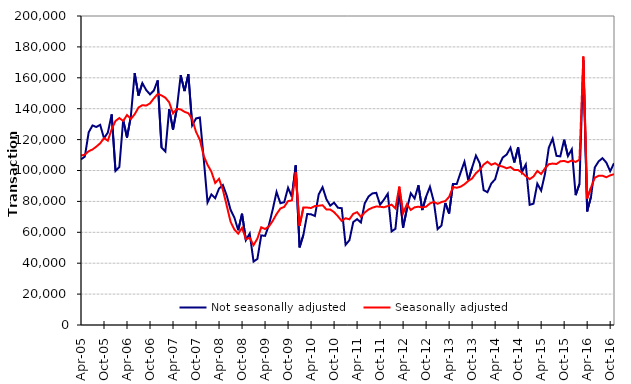
| Category | Not seasonally adjusted | Seasonally adjusted |
|---|---|---|
| 2005-04-01 | 107190 | 109680 |
| 2005-05-01 | 109010 | 110270 |
| 2005-06-01 | 124660 | 112460 |
| 2005-07-01 | 129170 | 113610 |
| 2005-08-01 | 128150 | 115470 |
| 2005-09-01 | 129560 | 117590 |
| 2005-10-01 | 120860 | 120990 |
| 2005-11-01 | 124540 | 119270 |
| 2005-12-01 | 136300 | 126640 |
| 2006-01-01 | 99740 | 132100 |
| 2006-02-01 | 102230 | 133940 |
| 2006-03-01 | 132710 | 132080 |
| 2006-04-01 | 121270 | 135880 |
| 2006-05-01 | 135030 | 133370 |
| 2006-06-01 | 162970 | 136400 |
| 2006-07-01 | 148490 | 140770 |
| 2006-08-01 | 156560 | 142280 |
| 2006-09-01 | 152100 | 142030 |
| 2006-10-01 | 149270 | 143440 |
| 2006-11-01 | 151770 | 146670 |
| 2006-12-01 | 158310 | 149510 |
| 2007-01-01 | 114880 | 148580 |
| 2007-02-01 | 112280 | 147120 |
| 2007-03-01 | 139780 | 144110 |
| 2007-04-01 | 126450 | 136980 |
| 2007-05-01 | 140110 | 139920 |
| 2007-06-01 | 161680 | 139530 |
| 2007-07-01 | 151390 | 137980 |
| 2007-08-01 | 162330 | 137040 |
| 2007-09-01 | 129210 | 133260 |
| 2007-10-01 | 133700 | 124980 |
| 2007-11-01 | 134320 | 119940 |
| 2007-12-01 | 107680 | 109440 |
| 2008-01-01 | 79350 | 103660 |
| 2008-02-01 | 84540 | 99300 |
| 2008-03-01 | 82050 | 91920 |
| 2008-04-01 | 88350 | 94610 |
| 2008-05-01 | 90570 | 87440 |
| 2008-06-01 | 83780 | 77280 |
| 2008-07-01 | 74560 | 66860 |
| 2008-08-01 | 69560 | 61820 |
| 2008-09-01 | 61330 | 59130 |
| 2008-10-01 | 72020 | 62890 |
| 2008-11-01 | 54910 | 55610 |
| 2008-12-01 | 59180 | 56400 |
| 2009-01-01 | 41060 | 51660 |
| 2009-02-01 | 42750 | 55930 |
| 2009-03-01 | 57990 | 63250 |
| 2009-04-01 | 57690 | 62120 |
| 2009-05-01 | 64640 | 63760 |
| 2009-06-01 | 74760 | 67390 |
| 2009-07-01 | 86090 | 71810 |
| 2009-08-01 | 78820 | 75400 |
| 2009-09-01 | 79480 | 76470 |
| 2009-10-01 | 88840 | 80170 |
| 2009-11-01 | 82910 | 80640 |
| 2009-12-01 | 103320 | 98940 |
| 2010-01-01 | 50230 | 64150 |
| 2010-02-01 | 58370 | 76080 |
| 2010-03-01 | 71830 | 76000 |
| 2010-04-01 | 71660 | 75730 |
| 2010-05-01 | 70560 | 76990 |
| 2010-06-01 | 84580 | 77200 |
| 2010-07-01 | 89190 | 77510 |
| 2010-08-01 | 81420 | 74810 |
| 2010-09-01 | 77250 | 74760 |
| 2010-10-01 | 79190 | 73040 |
| 2010-11-01 | 75890 | 70380 |
| 2010-12-01 | 75600 | 67370 |
| 2011-01-01 | 51900 | 69090 |
| 2011-02-01 | 54880 | 68410 |
| 2011-03-01 | 66600 | 71930 |
| 2011-04-01 | 68510 | 73020 |
| 2011-05-01 | 66340 | 70020 |
| 2011-06-01 | 78780 | 72820 |
| 2011-07-01 | 83180 | 74770 |
| 2011-08-01 | 85180 | 75930 |
| 2011-09-01 | 85530 | 76690 |
| 2011-10-01 | 77840 | 76550 |
| 2011-11-01 | 81110 | 76190 |
| 2011-12-01 | 84940 | 76990 |
| 2012-01-01 | 60530 | 77890 |
| 2012-02-01 | 62300 | 75410 |
| 2012-03-01 | 86720 | 89570 |
| 2012-04-01 | 63040 | 72340 |
| 2012-05-01 | 75350 | 78210 |
| 2012-06-01 | 85310 | 74470 |
| 2012-07-01 | 81880 | 76160 |
| 2012-08-01 | 90440 | 76570 |
| 2012-09-01 | 74390 | 76100 |
| 2012-10-01 | 83060 | 76590 |
| 2012-11-01 | 89450 | 78680 |
| 2012-12-01 | 80010 | 79710 |
| 2013-01-01 | 62060 | 78420 |
| 2013-02-01 | 64360 | 79600 |
| 2013-03-01 | 79000 | 80210 |
| 2013-04-01 | 72180 | 82920 |
| 2013-05-01 | 91270 | 89270 |
| 2013-06-01 | 91270 | 88840 |
| 2013-07-01 | 98710 | 89520 |
| 2013-08-01 | 105630 | 91070 |
| 2013-09-01 | 93680 | 93240 |
| 2013-10-01 | 101920 | 94840 |
| 2013-11-01 | 109670 | 98280 |
| 2013-12-01 | 104700 | 100450 |
| 2014-01-01 | 87280 | 103830 |
| 2014-02-01 | 85940 | 105670 |
| 2014-03-01 | 91570 | 103700 |
| 2014-04-01 | 94340 | 104700 |
| 2014-05-01 | 103110 | 103090 |
| 2014-06-01 | 108460 | 102510 |
| 2014-07-01 | 110280 | 101450 |
| 2014-08-01 | 114720 | 102260 |
| 2014-09-01 | 105170 | 100400 |
| 2014-10-01 | 114990 | 100290 |
| 2014-11-01 | 99010 | 98580 |
| 2014-12-01 | 103880 | 96320 |
| 2015-01-01 | 77750 | 94380 |
| 2015-02-01 | 78540 | 96080 |
| 2015-03-01 | 91490 | 99720 |
| 2015-04-01 | 86970 | 97720 |
| 2015-05-01 | 97800 | 101360 |
| 2015-06-01 | 114770 | 104080 |
| 2015-07-01 | 120610 | 104470 |
| 2015-08-01 | 109480 | 104210 |
| 2015-09-01 | 109160 | 105920 |
| 2015-10-01 | 119950 | 106200 |
| 2015-11-01 | 109370 | 105340 |
| 2015-12-01 | 113690 | 106500 |
| 2016-01-01 | 84030 | 105530 |
| 2016-02-01 | 91310 | 106980 |
| 2016-03-01 | 171370 | 173750 |
| 2016-04-01 | 73530 | 81960 |
| 2016-05-01 | 82940 | 88950 |
| 2016-06-01 | 102010 | 95350 |
| 2016-07-01 | 105940 | 96590 |
| 2016-08-01 | 107970 | 96630 |
| 2016-09-01 | 105140 | 95620 |
| 2016-10-01 | 99550 | 96850 |
| 2016-11-01 | 104670 | 97600 |